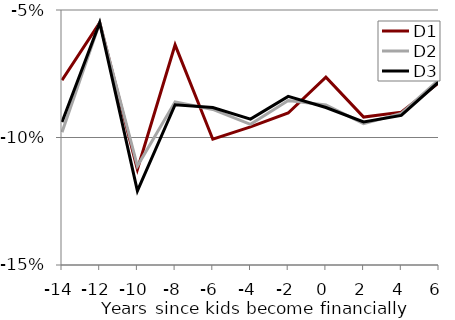
| Category | D1 | D2 | D3 |
|---|---|---|---|
| -14.0 | -0.077 | -0.098 | -0.094 |
| -12.0 | -0.055 | -0.055 | -0.055 |
| -10.0 | -0.113 | -0.111 | -0.121 |
| -8.0 | -0.064 | -0.086 | -0.087 |
| -6.0 | -0.101 | -0.089 | -0.088 |
| -4.0 | -0.096 | -0.095 | -0.093 |
| -2.0 | -0.09 | -0.085 | -0.084 |
| 0.0 | -0.076 | -0.087 | -0.088 |
| 2.0 | -0.092 | -0.095 | -0.094 |
| 4.0 | -0.09 | -0.091 | -0.091 |
| 6.0 | -0.078 | -0.077 | -0.078 |